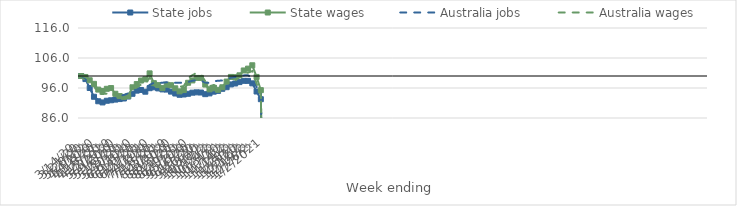
| Category | State jobs | State wages | Australia jobs | Australia wages |
|---|---|---|---|---|
| 14/03/2020 | 100 | 100 | 100 | 100 |
| 21/03/2020 | 98.972 | 99.674 | 99.218 | 99.669 |
| 28/03/2020 | 95.996 | 98.583 | 96.159 | 98.38 |
| 04/04/2020 | 93.075 | 97.389 | 93.511 | 96.663 |
| 11/04/2020 | 91.581 | 95.469 | 91.845 | 94.08 |
| 18/04/2020 | 91.189 | 94.999 | 91.454 | 93.993 |
| 25/04/2020 | 91.746 | 95.732 | 91.82 | 94.131 |
| 02/05/2020 | 91.908 | 95.98 | 92.24 | 94.625 |
| 09/05/2020 | 92.131 | 94.081 | 92.814 | 93.438 |
| 16/05/2020 | 92.311 | 93.303 | 93.355 | 92.628 |
| 23/05/2020 | 92.501 | 93.022 | 93.675 | 92.257 |
| 30/05/2020 | 93.156 | 93.357 | 94.182 | 93.555 |
| 06/06/2020 | 94.068 | 96.238 | 95.129 | 95.487 |
| 13/06/2020 | 95.115 | 97.316 | 95.64 | 96.179 |
| 20/06/2020 | 95.346 | 98.484 | 95.803 | 97.167 |
| 27/06/2020 | 94.766 | 98.894 | 95.768 | 97.377 |
| 04/07/2020 | 95.933 | 100.876 | 97.026 | 99.465 |
| 11/07/2020 | 96.22 | 97.618 | 97.722 | 96.839 |
| 18/07/2020 | 95.863 | 96.968 | 97.64 | 96.355 |
| 25/07/2020 | 95.528 | 95.967 | 97.768 | 96.035 |
| 01/08/2020 | 95.473 | 97.106 | 97.912 | 96.762 |
| 08/08/2020 | 94.792 | 96.929 | 97.848 | 97.159 |
| 15/08/2020 | 94.161 | 95.898 | 97.715 | 96.636 |
| 22/08/2020 | 93.736 | 94.875 | 97.726 | 96.439 |
| 29/08/2020 | 93.838 | 95.328 | 97.792 | 96.622 |
| 05/09/2020 | 94.07 | 97.742 | 97.988 | 99.323 |
| 12/09/2020 | 94.44 | 98.523 | 98.415 | 100.272 |
| 19/09/2020 | 94.557 | 99.357 | 98.579 | 101.043 |
| 26/09/2020 | 94.494 | 99.344 | 98.452 | 100.421 |
| 03/10/2020 | 93.945 | 97.148 | 97.813 | 98.297 |
| 10/10/2020 | 94.206 | 95.548 | 97.688 | 96.578 |
| 17/10/2020 | 94.776 | 95.905 | 98.252 | 97.02 |
| 24/10/2020 | 95.033 | 95.397 | 98.419 | 96.422 |
| 31/10/2020 | 95.733 | 96.249 | 98.499 | 96.422 |
| 07/11/2020 | 96.27 | 98.149 | 98.826 | 97.695 |
| 14/11/2020 | 97.197 | 99.69 | 99.425 | 98.506 |
| 21/11/2020 | 97.505 | 99.613 | 99.648 | 98.519 |
| 28/11/2020 | 97.97 | 100.226 | 99.873 | 99.566 |
| 05/12/2020 | 98.389 | 101.844 | 100.204 | 100.773 |
| 12/12/2020 | 98.378 | 102.463 | 100.228 | 101.122 |
| 19/12/2020 | 97.552 | 103.578 | 99.39 | 101.653 |
| 26/12/2020 | 94.826 | 99.688 | 96.352 | 97.474 |
| 02/01/2021 | 92.266 | 95.28 | 93.927 | 93.755 |